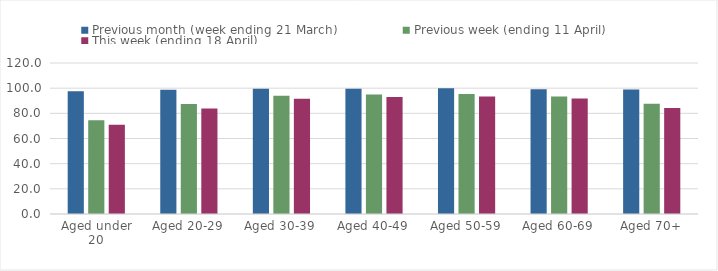
| Category | Previous month (week ending 21 March) | Previous week (ending 11 April) | This week (ending 18 April) |
|---|---|---|---|
| Aged under 20 | 97.473 | 74.434 | 70.831 |
| Aged 20-29 | 98.744 | 87.375 | 83.793 |
| Aged 30-39 | 99.517 | 94.022 | 91.523 |
| Aged 40-49 | 99.455 | 94.995 | 93.033 |
| Aged 50-59 | 99.958 | 95.394 | 93.345 |
| Aged 60-69 | 99.192 | 93.378 | 91.791 |
| Aged 70+ | 98.848 | 87.605 | 84.14 |